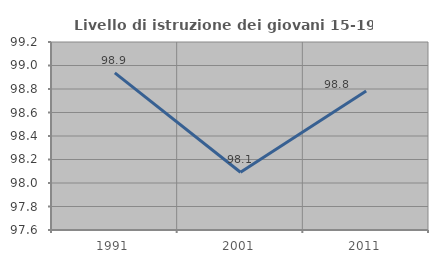
| Category | Livello di istruzione dei giovani 15-19 anni |
|---|---|
| 1991.0 | 98.938 |
| 2001.0 | 98.092 |
| 2011.0 | 98.783 |